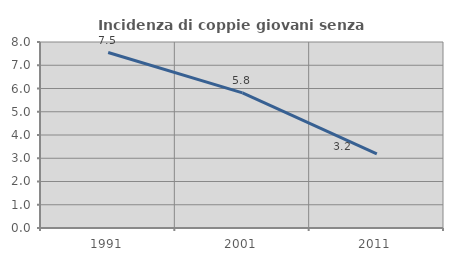
| Category | Incidenza di coppie giovani senza figli |
|---|---|
| 1991.0 | 7.547 |
| 2001.0 | 5.809 |
| 2011.0 | 3.191 |